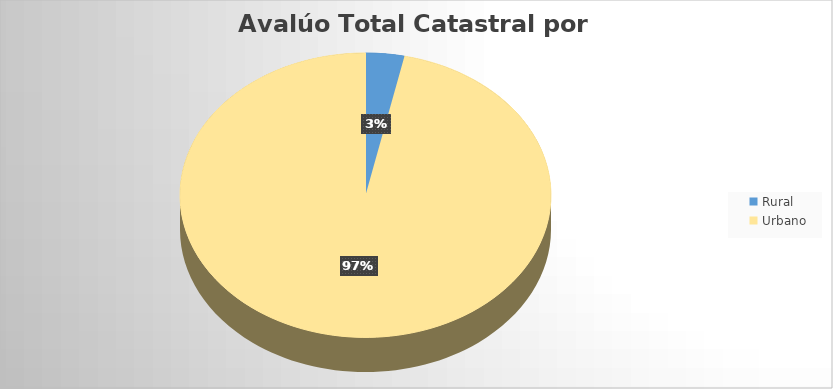
| Category | AvalúoTotal |
|---|---|
| Rural | 4614498602000 |
| Urbano | 132458147539627.02 |